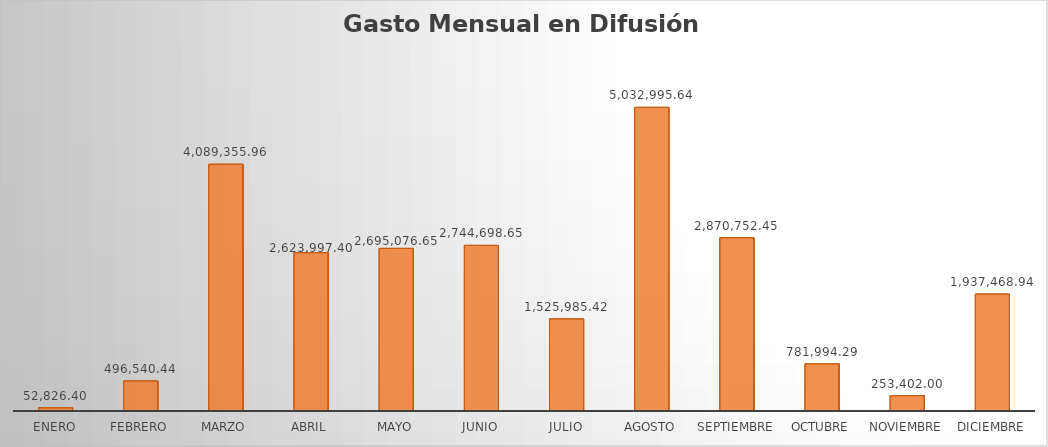
| Category | Monto |
|---|---|
| ENERO | 52826.4 |
| FEBRERO | 496540.44 |
| MARZO | 4089355.96 |
| ABRIL | 2623997.4 |
| MAYO | 2695076.65 |
| JUNIO | 2744698.65 |
| JULIO | 1525985.42 |
| AGOSTO | 5032995.64 |
| SEPTIEMBRE | 2870752.45 |
| OCTUBRE | 781994.29 |
| NOVIEMBRE | 253402 |
| DICIEMBRE | 1937468.94 |